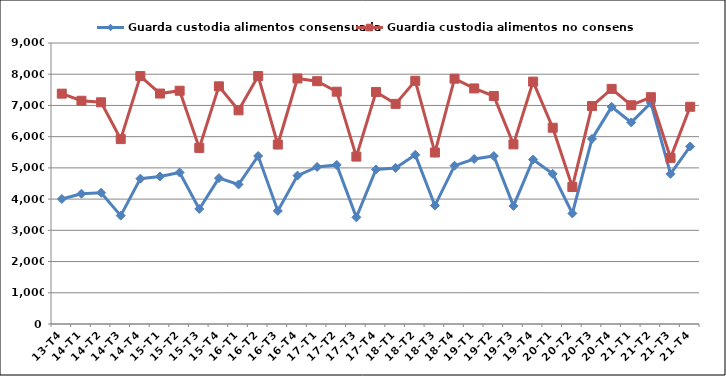
| Category | Guarda custodia alimentos consensuada | Guardia custodia alimentos no consensuada |
|---|---|---|
| 13-T4 | 4004 | 7378 |
| 14-T1 | 4173 | 7150 |
| 14-T2 | 4203 | 7101 |
| 14-T3 | 3471 | 5922 |
| 14-T4 | 4655 | 7941 |
| 15-T1 | 4724 | 7381 |
| 15-T2 | 4852 | 7471 |
| 15-T3 | 3684 | 5640 |
| 15-T4 | 4672 | 7612 |
| 16-T1 | 4468 | 6844 |
| 16-T2 | 5382 | 7942 |
| 16-T3 | 3622 | 5748 |
| 16-T4 | 4753 | 7864 |
| 17-T1 | 5030 | 7776 |
| 17-T2 | 5094 | 7441 |
| 17-T3 | 3417 | 5362 |
| 17-T4 | 4951 | 7432 |
| 18-T1 | 4998 | 7050 |
| 18-T2 | 5420 | 7789 |
| 18-T3 | 3793 | 5492 |
| 18-T4 | 5070 | 7857 |
| 19-T1 | 5285 | 7545 |
| 19-T2 | 5380 | 7303 |
| 19-T3 | 3782 | 5753 |
| 19-T4 | 5269 | 7763 |
| 20-T1 | 4809 | 6286 |
| 20-T2 | 3542 | 4387 |
| 20-T3 | 5930 | 6981 |
| 20-T4 | 6955 | 7530 |
| 21-T1 | 6456 | 7006 |
| 21-T2 | 7080 | 7264 |
| 21-T3 | 4810 | 5320 |
| 21-T4 | 5686 | 6958 |